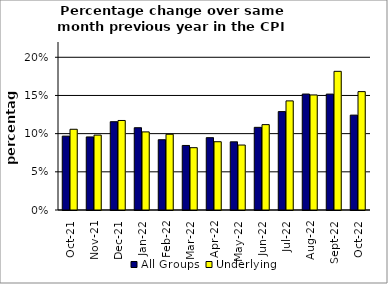
| Category | All Groups | Underlying |
|---|---|---|
| 2021-10-01 | 0.097 | 0.106 |
| 2021-11-01 | 0.096 | 0.098 |
| 2021-12-01 | 0.116 | 0.117 |
| 2022-01-01 | 0.108 | 0.102 |
| 2022-02-01 | 0.092 | 0.099 |
| 2022-03-01 | 0.085 | 0.082 |
| 2022-04-01 | 0.095 | 0.089 |
| 2022-05-01 | 0.089 | 0.085 |
| 2022-06-01 | 0.108 | 0.112 |
| 2022-07-01 | 0.129 | 0.143 |
| 2022-08-01 | 0.152 | 0.151 |
| 2022-09-01 | 0.152 | 0.182 |
| 2022-10-01 | 0.124 | 0.155 |